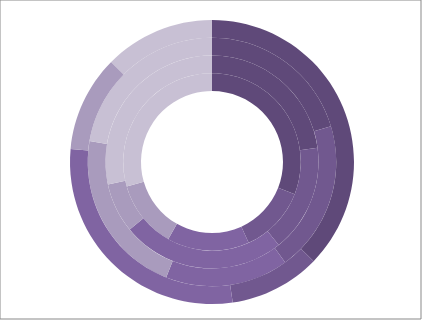
| Category | Hotel 1 | Hotel 2 | Hotel 3 | Hotel 4 |
|---|---|---|---|---|
| Svibanj | 47523 | 30394 | 40154 | 38542 |
| Lipanj | 18922 | 21738 | 38701 | 10715 |
| Srpanj | 23054 | 32993 | 31642 | 29750 |
| Kolovoz | 18948 | 10026 | 42770 | 11337 |
| Rujan | 45290 | 37746 | 43996 | 12987 |